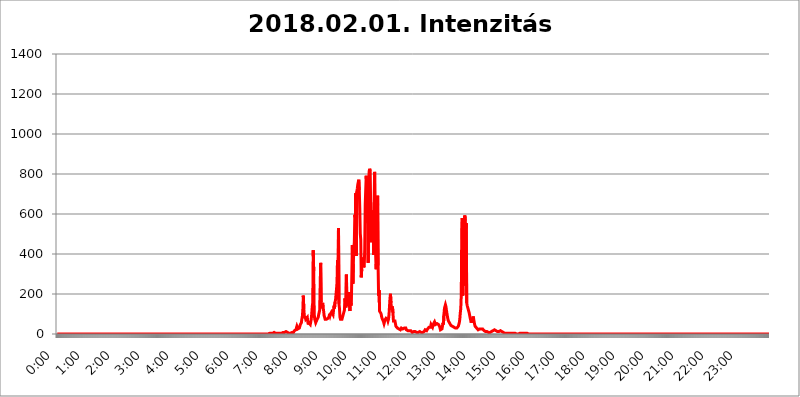
| Category | 2018.02.01. Intenzitás [W/m^2] |
|---|---|
| 0.0 | 0 |
| 0.0006944444444444445 | 0 |
| 0.001388888888888889 | 0 |
| 0.0020833333333333333 | 0 |
| 0.002777777777777778 | 0 |
| 0.003472222222222222 | 0 |
| 0.004166666666666667 | 0 |
| 0.004861111111111111 | 0 |
| 0.005555555555555556 | 0 |
| 0.0062499999999999995 | 0 |
| 0.006944444444444444 | 0 |
| 0.007638888888888889 | 0 |
| 0.008333333333333333 | 0 |
| 0.009027777777777779 | 0 |
| 0.009722222222222222 | 0 |
| 0.010416666666666666 | 0 |
| 0.011111111111111112 | 0 |
| 0.011805555555555555 | 0 |
| 0.012499999999999999 | 0 |
| 0.013194444444444444 | 0 |
| 0.013888888888888888 | 0 |
| 0.014583333333333332 | 0 |
| 0.015277777777777777 | 0 |
| 0.015972222222222224 | 0 |
| 0.016666666666666666 | 0 |
| 0.017361111111111112 | 0 |
| 0.018055555555555557 | 0 |
| 0.01875 | 0 |
| 0.019444444444444445 | 0 |
| 0.02013888888888889 | 0 |
| 0.020833333333333332 | 0 |
| 0.02152777777777778 | 0 |
| 0.022222222222222223 | 0 |
| 0.02291666666666667 | 0 |
| 0.02361111111111111 | 0 |
| 0.024305555555555556 | 0 |
| 0.024999999999999998 | 0 |
| 0.025694444444444447 | 0 |
| 0.02638888888888889 | 0 |
| 0.027083333333333334 | 0 |
| 0.027777777777777776 | 0 |
| 0.02847222222222222 | 0 |
| 0.029166666666666664 | 0 |
| 0.029861111111111113 | 0 |
| 0.030555555555555555 | 0 |
| 0.03125 | 0 |
| 0.03194444444444445 | 0 |
| 0.03263888888888889 | 0 |
| 0.03333333333333333 | 0 |
| 0.034027777777777775 | 0 |
| 0.034722222222222224 | 0 |
| 0.035416666666666666 | 0 |
| 0.036111111111111115 | 0 |
| 0.03680555555555556 | 0 |
| 0.0375 | 0 |
| 0.03819444444444444 | 0 |
| 0.03888888888888889 | 0 |
| 0.03958333333333333 | 0 |
| 0.04027777777777778 | 0 |
| 0.04097222222222222 | 0 |
| 0.041666666666666664 | 0 |
| 0.042361111111111106 | 0 |
| 0.04305555555555556 | 0 |
| 0.043750000000000004 | 0 |
| 0.044444444444444446 | 0 |
| 0.04513888888888889 | 0 |
| 0.04583333333333334 | 0 |
| 0.04652777777777778 | 0 |
| 0.04722222222222222 | 0 |
| 0.04791666666666666 | 0 |
| 0.04861111111111111 | 0 |
| 0.049305555555555554 | 0 |
| 0.049999999999999996 | 0 |
| 0.05069444444444445 | 0 |
| 0.051388888888888894 | 0 |
| 0.052083333333333336 | 0 |
| 0.05277777777777778 | 0 |
| 0.05347222222222222 | 0 |
| 0.05416666666666667 | 0 |
| 0.05486111111111111 | 0 |
| 0.05555555555555555 | 0 |
| 0.05625 | 0 |
| 0.05694444444444444 | 0 |
| 0.057638888888888885 | 0 |
| 0.05833333333333333 | 0 |
| 0.05902777777777778 | 0 |
| 0.059722222222222225 | 0 |
| 0.06041666666666667 | 0 |
| 0.061111111111111116 | 0 |
| 0.06180555555555556 | 0 |
| 0.0625 | 0 |
| 0.06319444444444444 | 0 |
| 0.06388888888888888 | 0 |
| 0.06458333333333334 | 0 |
| 0.06527777777777778 | 0 |
| 0.06597222222222222 | 0 |
| 0.06666666666666667 | 0 |
| 0.06736111111111111 | 0 |
| 0.06805555555555555 | 0 |
| 0.06874999999999999 | 0 |
| 0.06944444444444443 | 0 |
| 0.07013888888888889 | 0 |
| 0.07083333333333333 | 0 |
| 0.07152777777777779 | 0 |
| 0.07222222222222223 | 0 |
| 0.07291666666666667 | 0 |
| 0.07361111111111111 | 0 |
| 0.07430555555555556 | 0 |
| 0.075 | 0 |
| 0.07569444444444444 | 0 |
| 0.0763888888888889 | 0 |
| 0.07708333333333334 | 0 |
| 0.07777777777777778 | 0 |
| 0.07847222222222222 | 0 |
| 0.07916666666666666 | 0 |
| 0.0798611111111111 | 0 |
| 0.08055555555555556 | 0 |
| 0.08125 | 0 |
| 0.08194444444444444 | 0 |
| 0.08263888888888889 | 0 |
| 0.08333333333333333 | 0 |
| 0.08402777777777777 | 0 |
| 0.08472222222222221 | 0 |
| 0.08541666666666665 | 0 |
| 0.08611111111111112 | 0 |
| 0.08680555555555557 | 0 |
| 0.08750000000000001 | 0 |
| 0.08819444444444445 | 0 |
| 0.08888888888888889 | 0 |
| 0.08958333333333333 | 0 |
| 0.09027777777777778 | 0 |
| 0.09097222222222222 | 0 |
| 0.09166666666666667 | 0 |
| 0.09236111111111112 | 0 |
| 0.09305555555555556 | 0 |
| 0.09375 | 0 |
| 0.09444444444444444 | 0 |
| 0.09513888888888888 | 0 |
| 0.09583333333333333 | 0 |
| 0.09652777777777777 | 0 |
| 0.09722222222222222 | 0 |
| 0.09791666666666667 | 0 |
| 0.09861111111111111 | 0 |
| 0.09930555555555555 | 0 |
| 0.09999999999999999 | 0 |
| 0.10069444444444443 | 0 |
| 0.1013888888888889 | 0 |
| 0.10208333333333335 | 0 |
| 0.10277777777777779 | 0 |
| 0.10347222222222223 | 0 |
| 0.10416666666666667 | 0 |
| 0.10486111111111111 | 0 |
| 0.10555555555555556 | 0 |
| 0.10625 | 0 |
| 0.10694444444444444 | 0 |
| 0.1076388888888889 | 0 |
| 0.10833333333333334 | 0 |
| 0.10902777777777778 | 0 |
| 0.10972222222222222 | 0 |
| 0.1111111111111111 | 0 |
| 0.11180555555555556 | 0 |
| 0.11180555555555556 | 0 |
| 0.1125 | 0 |
| 0.11319444444444444 | 0 |
| 0.11388888888888889 | 0 |
| 0.11458333333333333 | 0 |
| 0.11527777777777777 | 0 |
| 0.11597222222222221 | 0 |
| 0.11666666666666665 | 0 |
| 0.1173611111111111 | 0 |
| 0.11805555555555557 | 0 |
| 0.11944444444444445 | 0 |
| 0.12013888888888889 | 0 |
| 0.12083333333333333 | 0 |
| 0.12152777777777778 | 0 |
| 0.12222222222222223 | 0 |
| 0.12291666666666667 | 0 |
| 0.12291666666666667 | 0 |
| 0.12361111111111112 | 0 |
| 0.12430555555555556 | 0 |
| 0.125 | 0 |
| 0.12569444444444444 | 0 |
| 0.12638888888888888 | 0 |
| 0.12708333333333333 | 0 |
| 0.16875 | 0 |
| 0.12847222222222224 | 0 |
| 0.12916666666666668 | 0 |
| 0.12986111111111112 | 0 |
| 0.13055555555555556 | 0 |
| 0.13125 | 0 |
| 0.13194444444444445 | 0 |
| 0.1326388888888889 | 0 |
| 0.13333333333333333 | 0 |
| 0.13402777777777777 | 0 |
| 0.13402777777777777 | 0 |
| 0.13472222222222222 | 0 |
| 0.13541666666666666 | 0 |
| 0.1361111111111111 | 0 |
| 0.13749999999999998 | 0 |
| 0.13819444444444443 | 0 |
| 0.1388888888888889 | 0 |
| 0.13958333333333334 | 0 |
| 0.14027777777777778 | 0 |
| 0.14097222222222222 | 0 |
| 0.14166666666666666 | 0 |
| 0.1423611111111111 | 0 |
| 0.14305555555555557 | 0 |
| 0.14375000000000002 | 0 |
| 0.14444444444444446 | 0 |
| 0.1451388888888889 | 0 |
| 0.1451388888888889 | 0 |
| 0.14652777777777778 | 0 |
| 0.14722222222222223 | 0 |
| 0.14791666666666667 | 0 |
| 0.1486111111111111 | 0 |
| 0.14930555555555555 | 0 |
| 0.15 | 0 |
| 0.15069444444444444 | 0 |
| 0.15138888888888888 | 0 |
| 0.15208333333333332 | 0 |
| 0.15277777777777776 | 0 |
| 0.15347222222222223 | 0 |
| 0.15416666666666667 | 0 |
| 0.15486111111111112 | 0 |
| 0.15555555555555556 | 0 |
| 0.15625 | 0 |
| 0.15694444444444444 | 0 |
| 0.15763888888888888 | 0 |
| 0.15833333333333333 | 0 |
| 0.15902777777777777 | 0 |
| 0.15972222222222224 | 0 |
| 0.16041666666666668 | 0 |
| 0.16111111111111112 | 0 |
| 0.16180555555555556 | 0 |
| 0.1625 | 0 |
| 0.16319444444444445 | 0 |
| 0.1638888888888889 | 0 |
| 0.16458333333333333 | 0 |
| 0.16527777777777777 | 0 |
| 0.16597222222222222 | 0 |
| 0.16666666666666666 | 0 |
| 0.1673611111111111 | 0 |
| 0.16805555555555554 | 0 |
| 0.16874999999999998 | 0 |
| 0.16944444444444443 | 0 |
| 0.17013888888888887 | 0 |
| 0.1708333333333333 | 0 |
| 0.17152777777777775 | 0 |
| 0.17222222222222225 | 0 |
| 0.1729166666666667 | 0 |
| 0.17361111111111113 | 0 |
| 0.17430555555555557 | 0 |
| 0.17500000000000002 | 0 |
| 0.17569444444444446 | 0 |
| 0.1763888888888889 | 0 |
| 0.17708333333333334 | 0 |
| 0.17777777777777778 | 0 |
| 0.17847222222222223 | 0 |
| 0.17916666666666667 | 0 |
| 0.1798611111111111 | 0 |
| 0.18055555555555555 | 0 |
| 0.18125 | 0 |
| 0.18194444444444444 | 0 |
| 0.1826388888888889 | 0 |
| 0.18333333333333335 | 0 |
| 0.1840277777777778 | 0 |
| 0.18472222222222223 | 0 |
| 0.18541666666666667 | 0 |
| 0.18611111111111112 | 0 |
| 0.18680555555555556 | 0 |
| 0.1875 | 0 |
| 0.18819444444444444 | 0 |
| 0.18888888888888888 | 0 |
| 0.18958333333333333 | 0 |
| 0.19027777777777777 | 0 |
| 0.1909722222222222 | 0 |
| 0.19166666666666665 | 0 |
| 0.19236111111111112 | 0 |
| 0.19305555555555554 | 0 |
| 0.19375 | 0 |
| 0.19444444444444445 | 0 |
| 0.1951388888888889 | 0 |
| 0.19583333333333333 | 0 |
| 0.19652777777777777 | 0 |
| 0.19722222222222222 | 0 |
| 0.19791666666666666 | 0 |
| 0.1986111111111111 | 0 |
| 0.19930555555555554 | 0 |
| 0.19999999999999998 | 0 |
| 0.20069444444444443 | 0 |
| 0.20138888888888887 | 0 |
| 0.2020833333333333 | 0 |
| 0.2027777777777778 | 0 |
| 0.2034722222222222 | 0 |
| 0.2041666666666667 | 0 |
| 0.20486111111111113 | 0 |
| 0.20555555555555557 | 0 |
| 0.20625000000000002 | 0 |
| 0.20694444444444446 | 0 |
| 0.2076388888888889 | 0 |
| 0.20833333333333334 | 0 |
| 0.20902777777777778 | 0 |
| 0.20972222222222223 | 0 |
| 0.21041666666666667 | 0 |
| 0.2111111111111111 | 0 |
| 0.21180555555555555 | 0 |
| 0.2125 | 0 |
| 0.21319444444444444 | 0 |
| 0.2138888888888889 | 0 |
| 0.21458333333333335 | 0 |
| 0.2152777777777778 | 0 |
| 0.21597222222222223 | 0 |
| 0.21666666666666667 | 0 |
| 0.21736111111111112 | 0 |
| 0.21805555555555556 | 0 |
| 0.21875 | 0 |
| 0.21944444444444444 | 0 |
| 0.22013888888888888 | 0 |
| 0.22083333333333333 | 0 |
| 0.22152777777777777 | 0 |
| 0.2222222222222222 | 0 |
| 0.22291666666666665 | 0 |
| 0.2236111111111111 | 0 |
| 0.22430555555555556 | 0 |
| 0.225 | 0 |
| 0.22569444444444445 | 0 |
| 0.2263888888888889 | 0 |
| 0.22708333333333333 | 0 |
| 0.22777777777777777 | 0 |
| 0.22847222222222222 | 0 |
| 0.22916666666666666 | 0 |
| 0.2298611111111111 | 0 |
| 0.23055555555555554 | 0 |
| 0.23124999999999998 | 0 |
| 0.23194444444444443 | 0 |
| 0.23263888888888887 | 0 |
| 0.2333333333333333 | 0 |
| 0.2340277777777778 | 0 |
| 0.2347222222222222 | 0 |
| 0.2354166666666667 | 0 |
| 0.23611111111111113 | 0 |
| 0.23680555555555557 | 0 |
| 0.23750000000000002 | 0 |
| 0.23819444444444446 | 0 |
| 0.2388888888888889 | 0 |
| 0.23958333333333334 | 0 |
| 0.24027777777777778 | 0 |
| 0.24097222222222223 | 0 |
| 0.24166666666666667 | 0 |
| 0.2423611111111111 | 0 |
| 0.24305555555555555 | 0 |
| 0.24375 | 0 |
| 0.24444444444444446 | 0 |
| 0.24513888888888888 | 0 |
| 0.24583333333333335 | 0 |
| 0.2465277777777778 | 0 |
| 0.24722222222222223 | 0 |
| 0.24791666666666667 | 0 |
| 0.24861111111111112 | 0 |
| 0.24930555555555556 | 0 |
| 0.25 | 0 |
| 0.25069444444444444 | 0 |
| 0.2513888888888889 | 0 |
| 0.2520833333333333 | 0 |
| 0.25277777777777777 | 0 |
| 0.2534722222222222 | 0 |
| 0.25416666666666665 | 0 |
| 0.2548611111111111 | 0 |
| 0.2555555555555556 | 0 |
| 0.25625000000000003 | 0 |
| 0.2569444444444445 | 0 |
| 0.2576388888888889 | 0 |
| 0.25833333333333336 | 0 |
| 0.2590277777777778 | 0 |
| 0.25972222222222224 | 0 |
| 0.2604166666666667 | 0 |
| 0.2611111111111111 | 0 |
| 0.26180555555555557 | 0 |
| 0.2625 | 0 |
| 0.26319444444444445 | 0 |
| 0.2638888888888889 | 0 |
| 0.26458333333333334 | 0 |
| 0.2652777777777778 | 0 |
| 0.2659722222222222 | 0 |
| 0.26666666666666666 | 0 |
| 0.2673611111111111 | 0 |
| 0.26805555555555555 | 0 |
| 0.26875 | 0 |
| 0.26944444444444443 | 0 |
| 0.2701388888888889 | 0 |
| 0.2708333333333333 | 0 |
| 0.27152777777777776 | 0 |
| 0.2722222222222222 | 0 |
| 0.27291666666666664 | 0 |
| 0.2736111111111111 | 0 |
| 0.2743055555555555 | 0 |
| 0.27499999999999997 | 0 |
| 0.27569444444444446 | 0 |
| 0.27638888888888885 | 0 |
| 0.27708333333333335 | 0 |
| 0.2777777777777778 | 0 |
| 0.27847222222222223 | 0 |
| 0.2791666666666667 | 0 |
| 0.2798611111111111 | 0 |
| 0.28055555555555556 | 0 |
| 0.28125 | 0 |
| 0.28194444444444444 | 0 |
| 0.2826388888888889 | 0 |
| 0.2833333333333333 | 0 |
| 0.28402777777777777 | 0 |
| 0.2847222222222222 | 0 |
| 0.28541666666666665 | 0 |
| 0.28611111111111115 | 0 |
| 0.28680555555555554 | 0 |
| 0.28750000000000003 | 0 |
| 0.2881944444444445 | 0 |
| 0.2888888888888889 | 0 |
| 0.28958333333333336 | 0 |
| 0.2902777777777778 | 0 |
| 0.29097222222222224 | 0 |
| 0.2916666666666667 | 0 |
| 0.2923611111111111 | 0 |
| 0.29305555555555557 | 0 |
| 0.29375 | 0 |
| 0.29444444444444445 | 0 |
| 0.2951388888888889 | 0 |
| 0.29583333333333334 | 0 |
| 0.2965277777777778 | 3.525 |
| 0.2972222222222222 | 3.525 |
| 0.29791666666666666 | 3.525 |
| 0.2986111111111111 | 3.525 |
| 0.29930555555555555 | 3.525 |
| 0.3 | 3.525 |
| 0.30069444444444443 | 3.525 |
| 0.3013888888888889 | 3.525 |
| 0.3020833333333333 | 3.525 |
| 0.30277777777777776 | 3.525 |
| 0.3034722222222222 | 3.525 |
| 0.30416666666666664 | 7.887 |
| 0.3048611111111111 | 7.887 |
| 0.3055555555555555 | 7.887 |
| 0.30624999999999997 | 3.525 |
| 0.3069444444444444 | 3.525 |
| 0.3076388888888889 | 3.525 |
| 0.30833333333333335 | 3.525 |
| 0.3090277777777778 | 3.525 |
| 0.30972222222222223 | 3.525 |
| 0.3104166666666667 | 3.525 |
| 0.3111111111111111 | 3.525 |
| 0.31180555555555556 | 3.525 |
| 0.3125 | 3.525 |
| 0.31319444444444444 | 3.525 |
| 0.3138888888888889 | 7.887 |
| 0.3145833333333333 | 3.525 |
| 0.31527777777777777 | 3.525 |
| 0.3159722222222222 | 7.887 |
| 0.31666666666666665 | 7.887 |
| 0.31736111111111115 | 7.887 |
| 0.31805555555555554 | 7.887 |
| 0.31875000000000003 | 7.887 |
| 0.3194444444444445 | 7.887 |
| 0.3201388888888889 | 7.887 |
| 0.32083333333333336 | 12.257 |
| 0.3215277777777778 | 7.887 |
| 0.32222222222222224 | 7.887 |
| 0.3229166666666667 | 7.887 |
| 0.3236111111111111 | 7.887 |
| 0.32430555555555557 | 3.525 |
| 0.325 | 3.525 |
| 0.32569444444444445 | 3.525 |
| 0.3263888888888889 | 3.525 |
| 0.32708333333333334 | 3.525 |
| 0.3277777777777778 | 3.525 |
| 0.3284722222222222 | 7.887 |
| 0.32916666666666666 | 7.887 |
| 0.3298611111111111 | 3.525 |
| 0.33055555555555555 | 7.887 |
| 0.33125 | 7.887 |
| 0.33194444444444443 | 7.887 |
| 0.3326388888888889 | 16.636 |
| 0.3333333333333333 | 16.636 |
| 0.3340277777777778 | 16.636 |
| 0.3347222222222222 | 21.024 |
| 0.3354166666666667 | 29.823 |
| 0.3361111111111111 | 38.653 |
| 0.3368055555555556 | 38.653 |
| 0.33749999999999997 | 25.419 |
| 0.33819444444444446 | 25.419 |
| 0.33888888888888885 | 29.823 |
| 0.33958333333333335 | 29.823 |
| 0.34027777777777773 | 34.234 |
| 0.34097222222222223 | 47.511 |
| 0.3416666666666666 | 47.511 |
| 0.3423611111111111 | 56.398 |
| 0.3430555555555555 | 74.246 |
| 0.34375 | 87.692 |
| 0.3444444444444445 | 119.235 |
| 0.3451388888888889 | 191.937 |
| 0.3458333333333334 | 123.758 |
| 0.34652777777777777 | 92.184 |
| 0.34722222222222227 | 78.722 |
| 0.34791666666666665 | 87.692 |
| 0.34861111111111115 | 74.246 |
| 0.34930555555555554 | 69.775 |
| 0.35000000000000003 | 74.246 |
| 0.3506944444444444 | 83.205 |
| 0.3513888888888889 | 60.85 |
| 0.3520833333333333 | 47.511 |
| 0.3527777777777778 | 56.398 |
| 0.3534722222222222 | 56.398 |
| 0.3541666666666667 | 51.951 |
| 0.3548611111111111 | 47.511 |
| 0.35555555555555557 | 47.511 |
| 0.35625 | 74.246 |
| 0.35694444444444445 | 101.184 |
| 0.3576388888888889 | 137.347 |
| 0.35833333333333334 | 155.509 |
| 0.3590277777777778 | 418.492 |
| 0.3597222222222222 | 314.98 |
| 0.36041666666666666 | 101.184 |
| 0.3611111111111111 | 74.246 |
| 0.36180555555555555 | 74.246 |
| 0.3625 | 56.398 |
| 0.36319444444444443 | 51.951 |
| 0.3638888888888889 | 60.85 |
| 0.3645833333333333 | 74.246 |
| 0.3652777777777778 | 78.722 |
| 0.3659722222222222 | 83.205 |
| 0.3666666666666667 | 96.682 |
| 0.3673611111111111 | 96.682 |
| 0.3680555555555556 | 119.235 |
| 0.36874999999999997 | 119.235 |
| 0.36944444444444446 | 355.712 |
| 0.37013888888888885 | 160.056 |
| 0.37083333333333335 | 128.284 |
| 0.37152777777777773 | 123.758 |
| 0.37222222222222223 | 155.509 |
| 0.3729166666666666 | 132.814 |
| 0.3736111111111111 | 114.716 |
| 0.3743055555555555 | 92.184 |
| 0.375 | 92.184 |
| 0.3756944444444445 | 74.246 |
| 0.3763888888888889 | 69.775 |
| 0.3770833333333334 | 78.722 |
| 0.37777777777777777 | 74.246 |
| 0.37847222222222227 | 74.246 |
| 0.37916666666666665 | 69.775 |
| 0.37986111111111115 | 78.722 |
| 0.38055555555555554 | 78.722 |
| 0.38125000000000003 | 87.692 |
| 0.3819444444444444 | 101.184 |
| 0.3826388888888889 | 92.184 |
| 0.3833333333333333 | 101.184 |
| 0.3840277777777778 | 105.69 |
| 0.3847222222222222 | 110.201 |
| 0.3854166666666667 | 105.69 |
| 0.3861111111111111 | 110.201 |
| 0.38680555555555557 | 96.682 |
| 0.3875 | 119.235 |
| 0.38819444444444445 | 141.884 |
| 0.3888888888888889 | 128.284 |
| 0.38958333333333334 | 160.056 |
| 0.3902777777777778 | 169.156 |
| 0.3909722222222222 | 196.497 |
| 0.39166666666666666 | 223.873 |
| 0.3923611111111111 | 255.813 |
| 0.39305555555555555 | 369.23 |
| 0.39375 | 173.709 |
| 0.39444444444444443 | 528.2 |
| 0.3951388888888889 | 150.964 |
| 0.3958333333333333 | 128.284 |
| 0.3965277777777778 | 83.205 |
| 0.3972222222222222 | 74.246 |
| 0.3979166666666667 | 69.775 |
| 0.3986111111111111 | 69.775 |
| 0.3993055555555556 | 74.246 |
| 0.39999999999999997 | 74.246 |
| 0.40069444444444446 | 92.184 |
| 0.40138888888888885 | 92.184 |
| 0.40208333333333335 | 110.201 |
| 0.40277777777777773 | 119.235 |
| 0.40347222222222223 | 178.264 |
| 0.4041666666666666 | 160.056 |
| 0.4048611111111111 | 132.814 |
| 0.4055555555555555 | 296.808 |
| 0.40625 | 141.884 |
| 0.4069444444444445 | 164.605 |
| 0.4076388888888889 | 187.378 |
| 0.4083333333333334 | 155.509 |
| 0.40902777777777777 | 210.182 |
| 0.40972222222222227 | 155.509 |
| 0.41041666666666665 | 114.716 |
| 0.41111111111111115 | 164.605 |
| 0.41180555555555554 | 141.884 |
| 0.41250000000000003 | 155.509 |
| 0.4131944444444444 | 160.056 |
| 0.4138888888888889 | 445.129 |
| 0.4145833333333333 | 251.251 |
| 0.4152777777777778 | 351.198 |
| 0.4159722222222222 | 431.833 |
| 0.4166666666666667 | 458.38 |
| 0.4173611111111111 | 596.45 |
| 0.41805555555555557 | 583.779 |
| 0.41875 | 703.762 |
| 0.41944444444444445 | 391.685 |
| 0.4201388888888889 | 711.832 |
| 0.42083333333333334 | 727.896 |
| 0.4215277777777778 | 747.834 |
| 0.4222222222222222 | 759.723 |
| 0.42291666666666666 | 771.559 |
| 0.4236111111111111 | 719.877 |
| 0.42430555555555555 | 629.948 |
| 0.425 | 502.192 |
| 0.42569444444444443 | 471.582 |
| 0.4263888888888889 | 283.156 |
| 0.4270833333333333 | 324.052 |
| 0.4277777777777778 | 382.715 |
| 0.4284722222222222 | 360.221 |
| 0.4291666666666667 | 364.728 |
| 0.4298611111111111 | 333.113 |
| 0.4305555555555556 | 342.162 |
| 0.43124999999999997 | 422.943 |
| 0.43194444444444446 | 646.537 |
| 0.43263888888888885 | 719.877 |
| 0.43333333333333335 | 791.169 |
| 0.43402777777777773 | 747.834 |
| 0.43472222222222223 | 767.62 |
| 0.4354166666666666 | 553.986 |
| 0.4361111111111111 | 355.712 |
| 0.4368055555555555 | 767.62 |
| 0.4375 | 814.519 |
| 0.4381944444444445 | 826.123 |
| 0.4388888888888889 | 814.519 |
| 0.4395833333333334 | 650.667 |
| 0.44027777777777777 | 458.38 |
| 0.44097222222222227 | 541.121 |
| 0.44166666666666665 | 536.82 |
| 0.44236111111111115 | 515.223 |
| 0.44305555555555554 | 617.436 |
| 0.44375000000000003 | 396.164 |
| 0.4444444444444444 | 658.909 |
| 0.4451388888888889 | 810.641 |
| 0.4458333333333333 | 502.192 |
| 0.4465277777777778 | 400.638 |
| 0.4472222222222222 | 324.052 |
| 0.4479166666666667 | 373.729 |
| 0.4486111111111111 | 333.113 |
| 0.44930555555555557 | 691.608 |
| 0.45 | 342.162 |
| 0.45069444444444445 | 191.937 |
| 0.4513888888888889 | 219.309 |
| 0.45208333333333334 | 114.716 |
| 0.4527777777777778 | 110.201 |
| 0.4534722222222222 | 110.201 |
| 0.45416666666666666 | 101.184 |
| 0.4548611111111111 | 87.692 |
| 0.45555555555555555 | 78.722 |
| 0.45625 | 74.246 |
| 0.45694444444444443 | 74.246 |
| 0.4576388888888889 | 60.85 |
| 0.4583333333333333 | 51.951 |
| 0.4590277777777778 | 60.85 |
| 0.4597222222222222 | 69.775 |
| 0.4604166666666667 | 74.246 |
| 0.4611111111111111 | 78.722 |
| 0.4618055555555556 | 78.722 |
| 0.46249999999999997 | 78.722 |
| 0.46319444444444446 | 74.246 |
| 0.46388888888888885 | 65.31 |
| 0.46458333333333335 | 74.246 |
| 0.46527777777777773 | 96.682 |
| 0.46597222222222223 | 137.347 |
| 0.4666666666666666 | 178.264 |
| 0.4673611111111111 | 201.058 |
| 0.4680555555555555 | 155.509 |
| 0.46875 | 128.284 |
| 0.4694444444444445 | 119.235 |
| 0.4701388888888889 | 137.347 |
| 0.4708333333333334 | 105.69 |
| 0.47152777777777777 | 65.31 |
| 0.47222222222222227 | 65.31 |
| 0.47291666666666665 | 65.31 |
| 0.47361111111111115 | 65.31 |
| 0.47430555555555554 | 60.85 |
| 0.47500000000000003 | 38.653 |
| 0.4756944444444444 | 34.234 |
| 0.4763888888888889 | 38.653 |
| 0.4770833333333333 | 29.823 |
| 0.4777777777777778 | 29.823 |
| 0.4784722222222222 | 29.823 |
| 0.4791666666666667 | 25.419 |
| 0.4798611111111111 | 21.024 |
| 0.48055555555555557 | 21.024 |
| 0.48125 | 21.024 |
| 0.48194444444444445 | 25.419 |
| 0.4826388888888889 | 29.823 |
| 0.48333333333333334 | 29.823 |
| 0.4840277777777778 | 29.823 |
| 0.4847222222222222 | 25.419 |
| 0.48541666666666666 | 25.419 |
| 0.4861111111111111 | 25.419 |
| 0.48680555555555555 | 29.823 |
| 0.4875 | 25.419 |
| 0.48819444444444443 | 29.823 |
| 0.4888888888888889 | 29.823 |
| 0.4895833333333333 | 21.024 |
| 0.4902777777777778 | 16.636 |
| 0.4909722222222222 | 16.636 |
| 0.4916666666666667 | 16.636 |
| 0.4923611111111111 | 12.257 |
| 0.4930555555555556 | 12.257 |
| 0.49374999999999997 | 16.636 |
| 0.49444444444444446 | 16.636 |
| 0.49513888888888885 | 21.024 |
| 0.49583333333333335 | 16.636 |
| 0.49652777777777773 | 12.257 |
| 0.49722222222222223 | 12.257 |
| 0.4979166666666666 | 7.887 |
| 0.4986111111111111 | 12.257 |
| 0.4993055555555555 | 12.257 |
| 0.5 | 12.257 |
| 0.5006944444444444 | 12.257 |
| 0.5013888888888889 | 12.257 |
| 0.5020833333333333 | 12.257 |
| 0.5027777777777778 | 7.887 |
| 0.5034722222222222 | 7.887 |
| 0.5041666666666667 | 7.887 |
| 0.5048611111111111 | 12.257 |
| 0.5055555555555555 | 7.887 |
| 0.50625 | 7.887 |
| 0.5069444444444444 | 7.887 |
| 0.5076388888888889 | 7.887 |
| 0.5083333333333333 | 12.257 |
| 0.5090277777777777 | 12.257 |
| 0.5097222222222222 | 12.257 |
| 0.5104166666666666 | 7.887 |
| 0.5111111111111112 | 7.887 |
| 0.5118055555555555 | 7.887 |
| 0.5125000000000001 | 7.887 |
| 0.5131944444444444 | 12.257 |
| 0.513888888888889 | 12.257 |
| 0.5145833333333333 | 12.257 |
| 0.5152777777777778 | 16.636 |
| 0.5159722222222222 | 21.024 |
| 0.5166666666666667 | 21.024 |
| 0.517361111111111 | 16.636 |
| 0.5180555555555556 | 16.636 |
| 0.5187499999999999 | 21.024 |
| 0.5194444444444445 | 25.419 |
| 0.5201388888888888 | 29.823 |
| 0.5208333333333334 | 29.823 |
| 0.5215277777777778 | 34.234 |
| 0.5222222222222223 | 38.653 |
| 0.5229166666666667 | 34.234 |
| 0.5236111111111111 | 34.234 |
| 0.5243055555555556 | 47.511 |
| 0.525 | 51.951 |
| 0.5256944444444445 | 43.079 |
| 0.5263888888888889 | 34.234 |
| 0.5270833333333333 | 38.653 |
| 0.5277777777777778 | 51.951 |
| 0.5284722222222222 | 51.951 |
| 0.5291666666666667 | 60.85 |
| 0.5298611111111111 | 56.398 |
| 0.5305555555555556 | 47.511 |
| 0.53125 | 47.511 |
| 0.5319444444444444 | 47.511 |
| 0.5326388888888889 | 51.951 |
| 0.5333333333333333 | 47.511 |
| 0.5340277777777778 | 47.511 |
| 0.5347222222222222 | 47.511 |
| 0.5354166666666667 | 43.079 |
| 0.5361111111111111 | 38.653 |
| 0.5368055555555555 | 29.823 |
| 0.5375 | 21.024 |
| 0.5381944444444444 | 21.024 |
| 0.5388888888888889 | 21.024 |
| 0.5395833333333333 | 25.419 |
| 0.5402777777777777 | 38.653 |
| 0.5409722222222222 | 56.398 |
| 0.5416666666666666 | 47.511 |
| 0.5423611111111112 | 96.682 |
| 0.5430555555555555 | 128.284 |
| 0.5437500000000001 | 137.347 |
| 0.5444444444444444 | 146.423 |
| 0.545138888888889 | 137.347 |
| 0.5458333333333333 | 119.235 |
| 0.5465277777777778 | 114.716 |
| 0.5472222222222222 | 87.692 |
| 0.5479166666666667 | 74.246 |
| 0.548611111111111 | 65.31 |
| 0.5493055555555556 | 65.31 |
| 0.5499999999999999 | 65.31 |
| 0.5506944444444445 | 51.951 |
| 0.5513888888888888 | 47.511 |
| 0.5520833333333334 | 43.079 |
| 0.5527777777777778 | 43.079 |
| 0.5534722222222223 | 38.653 |
| 0.5541666666666667 | 38.653 |
| 0.5548611111111111 | 34.234 |
| 0.5555555555555556 | 34.234 |
| 0.55625 | 34.234 |
| 0.5569444444444445 | 29.823 |
| 0.5576388888888889 | 29.823 |
| 0.5583333333333333 | 29.823 |
| 0.5590277777777778 | 29.823 |
| 0.5597222222222222 | 29.823 |
| 0.5604166666666667 | 29.823 |
| 0.5611111111111111 | 29.823 |
| 0.5618055555555556 | 34.234 |
| 0.5625 | 38.653 |
| 0.5631944444444444 | 47.511 |
| 0.5638888888888889 | 56.398 |
| 0.5645833333333333 | 74.246 |
| 0.5652777777777778 | 105.69 |
| 0.5659722222222222 | 128.284 |
| 0.5666666666666667 | 196.497 |
| 0.5673611111111111 | 515.223 |
| 0.5680555555555555 | 579.542 |
| 0.56875 | 191.937 |
| 0.5694444444444444 | 523.88 |
| 0.5701388888888889 | 575.299 |
| 0.5708333333333333 | 242.127 |
| 0.5715277777777777 | 592.233 |
| 0.5722222222222222 | 566.793 |
| 0.5729166666666666 | 528.2 |
| 0.5736111111111112 | 553.986 |
| 0.5743055555555555 | 155.509 |
| 0.5750000000000001 | 141.884 |
| 0.5756944444444444 | 141.884 |
| 0.576388888888889 | 141.884 |
| 0.5770833333333333 | 114.716 |
| 0.5777777777777778 | 105.69 |
| 0.5784722222222222 | 92.184 |
| 0.5791666666666667 | 78.722 |
| 0.579861111111111 | 69.775 |
| 0.5805555555555556 | 56.398 |
| 0.5812499999999999 | 65.31 |
| 0.5819444444444445 | 69.775 |
| 0.5826388888888888 | 78.722 |
| 0.5833333333333334 | 87.692 |
| 0.5840277777777778 | 74.246 |
| 0.5847222222222223 | 60.85 |
| 0.5854166666666667 | 47.511 |
| 0.5861111111111111 | 38.653 |
| 0.5868055555555556 | 38.653 |
| 0.5875 | 34.234 |
| 0.5881944444444445 | 29.823 |
| 0.5888888888888889 | 25.419 |
| 0.5895833333333333 | 25.419 |
| 0.5902777777777778 | 21.024 |
| 0.5909722222222222 | 21.024 |
| 0.5916666666666667 | 25.419 |
| 0.5923611111111111 | 25.419 |
| 0.5930555555555556 | 25.419 |
| 0.59375 | 25.419 |
| 0.5944444444444444 | 25.419 |
| 0.5951388888888889 | 25.419 |
| 0.5958333333333333 | 25.419 |
| 0.5965277777777778 | 25.419 |
| 0.5972222222222222 | 21.024 |
| 0.5979166666666667 | 21.024 |
| 0.5986111111111111 | 16.636 |
| 0.5993055555555555 | 16.636 |
| 0.6 | 16.636 |
| 0.6006944444444444 | 12.257 |
| 0.6013888888888889 | 12.257 |
| 0.6020833333333333 | 12.257 |
| 0.6027777777777777 | 12.257 |
| 0.6034722222222222 | 12.257 |
| 0.6041666666666666 | 12.257 |
| 0.6048611111111112 | 7.887 |
| 0.6055555555555555 | 7.887 |
| 0.6062500000000001 | 7.887 |
| 0.6069444444444444 | 7.887 |
| 0.607638888888889 | 12.257 |
| 0.6083333333333333 | 12.257 |
| 0.6090277777777778 | 12.257 |
| 0.6097222222222222 | 12.257 |
| 0.6104166666666667 | 12.257 |
| 0.611111111111111 | 16.636 |
| 0.6118055555555556 | 16.636 |
| 0.6124999999999999 | 16.636 |
| 0.6131944444444445 | 21.024 |
| 0.6138888888888888 | 21.024 |
| 0.6145833333333334 | 16.636 |
| 0.6152777777777778 | 16.636 |
| 0.6159722222222223 | 16.636 |
| 0.6166666666666667 | 16.636 |
| 0.6173611111111111 | 12.257 |
| 0.6180555555555556 | 12.257 |
| 0.61875 | 12.257 |
| 0.6194444444444445 | 12.257 |
| 0.6201388888888889 | 12.257 |
| 0.6208333333333333 | 12.257 |
| 0.6215277777777778 | 16.636 |
| 0.6222222222222222 | 16.636 |
| 0.6229166666666667 | 16.636 |
| 0.6236111111111111 | 12.257 |
| 0.6243055555555556 | 12.257 |
| 0.625 | 7.887 |
| 0.6256944444444444 | 7.887 |
| 0.6263888888888889 | 3.525 |
| 0.6270833333333333 | 3.525 |
| 0.6277777777777778 | 3.525 |
| 0.6284722222222222 | 3.525 |
| 0.6291666666666667 | 3.525 |
| 0.6298611111111111 | 3.525 |
| 0.6305555555555555 | 3.525 |
| 0.63125 | 3.525 |
| 0.6319444444444444 | 3.525 |
| 0.6326388888888889 | 3.525 |
| 0.6333333333333333 | 3.525 |
| 0.6340277777777777 | 3.525 |
| 0.6347222222222222 | 3.525 |
| 0.6354166666666666 | 3.525 |
| 0.6361111111111112 | 3.525 |
| 0.6368055555555555 | 3.525 |
| 0.6375000000000001 | 3.525 |
| 0.6381944444444444 | 3.525 |
| 0.638888888888889 | 3.525 |
| 0.6395833333333333 | 3.525 |
| 0.6402777777777778 | 3.525 |
| 0.6409722222222222 | 3.525 |
| 0.6416666666666667 | 3.525 |
| 0.642361111111111 | 3.525 |
| 0.6430555555555556 | 3.525 |
| 0.6437499999999999 | 0 |
| 0.6444444444444445 | 0 |
| 0.6451388888888888 | 0 |
| 0.6458333333333334 | 0 |
| 0.6465277777777778 | 0 |
| 0.6472222222222223 | 3.525 |
| 0.6479166666666667 | 3.525 |
| 0.6486111111111111 | 3.525 |
| 0.6493055555555556 | 3.525 |
| 0.65 | 3.525 |
| 0.6506944444444445 | 3.525 |
| 0.6513888888888889 | 3.525 |
| 0.6520833333333333 | 3.525 |
| 0.6527777777777778 | 3.525 |
| 0.6534722222222222 | 3.525 |
| 0.6541666666666667 | 3.525 |
| 0.6548611111111111 | 3.525 |
| 0.6555555555555556 | 3.525 |
| 0.65625 | 3.525 |
| 0.6569444444444444 | 3.525 |
| 0.6576388888888889 | 3.525 |
| 0.6583333333333333 | 3.525 |
| 0.6590277777777778 | 3.525 |
| 0.6597222222222222 | 3.525 |
| 0.6604166666666667 | 0 |
| 0.6611111111111111 | 0 |
| 0.6618055555555555 | 0 |
| 0.6625 | 0 |
| 0.6631944444444444 | 0 |
| 0.6638888888888889 | 0 |
| 0.6645833333333333 | 0 |
| 0.6652777777777777 | 0 |
| 0.6659722222222222 | 0 |
| 0.6666666666666666 | 0 |
| 0.6673611111111111 | 0 |
| 0.6680555555555556 | 0 |
| 0.6687500000000001 | 0 |
| 0.6694444444444444 | 0 |
| 0.6701388888888888 | 0 |
| 0.6708333333333334 | 0 |
| 0.6715277777777778 | 0 |
| 0.6722222222222222 | 0 |
| 0.6729166666666666 | 0 |
| 0.6736111111111112 | 0 |
| 0.6743055555555556 | 0 |
| 0.6749999999999999 | 0 |
| 0.6756944444444444 | 0 |
| 0.6763888888888889 | 0 |
| 0.6770833333333334 | 0 |
| 0.6777777777777777 | 0 |
| 0.6784722222222223 | 0 |
| 0.6791666666666667 | 0 |
| 0.6798611111111111 | 0 |
| 0.6805555555555555 | 0 |
| 0.68125 | 0 |
| 0.6819444444444445 | 0 |
| 0.6826388888888889 | 0 |
| 0.6833333333333332 | 0 |
| 0.6840277777777778 | 0 |
| 0.6847222222222222 | 0 |
| 0.6854166666666667 | 0 |
| 0.686111111111111 | 0 |
| 0.6868055555555556 | 0 |
| 0.6875 | 0 |
| 0.6881944444444444 | 0 |
| 0.688888888888889 | 0 |
| 0.6895833333333333 | 0 |
| 0.6902777777777778 | 0 |
| 0.6909722222222222 | 0 |
| 0.6916666666666668 | 0 |
| 0.6923611111111111 | 0 |
| 0.6930555555555555 | 0 |
| 0.69375 | 0 |
| 0.6944444444444445 | 0 |
| 0.6951388888888889 | 0 |
| 0.6958333333333333 | 0 |
| 0.6965277777777777 | 0 |
| 0.6972222222222223 | 0 |
| 0.6979166666666666 | 0 |
| 0.6986111111111111 | 0 |
| 0.6993055555555556 | 0 |
| 0.7000000000000001 | 0 |
| 0.7006944444444444 | 0 |
| 0.7013888888888888 | 0 |
| 0.7020833333333334 | 0 |
| 0.7027777777777778 | 0 |
| 0.7034722222222222 | 0 |
| 0.7041666666666666 | 0 |
| 0.7048611111111112 | 0 |
| 0.7055555555555556 | 0 |
| 0.7062499999999999 | 0 |
| 0.7069444444444444 | 0 |
| 0.7076388888888889 | 0 |
| 0.7083333333333334 | 0 |
| 0.7090277777777777 | 0 |
| 0.7097222222222223 | 0 |
| 0.7104166666666667 | 0 |
| 0.7111111111111111 | 0 |
| 0.7118055555555555 | 0 |
| 0.7125 | 0 |
| 0.7131944444444445 | 0 |
| 0.7138888888888889 | 0 |
| 0.7145833333333332 | 0 |
| 0.7152777777777778 | 0 |
| 0.7159722222222222 | 0 |
| 0.7166666666666667 | 0 |
| 0.717361111111111 | 0 |
| 0.7180555555555556 | 0 |
| 0.71875 | 0 |
| 0.7194444444444444 | 0 |
| 0.720138888888889 | 0 |
| 0.7208333333333333 | 0 |
| 0.7215277777777778 | 0 |
| 0.7222222222222222 | 0 |
| 0.7229166666666668 | 0 |
| 0.7236111111111111 | 0 |
| 0.7243055555555555 | 0 |
| 0.725 | 0 |
| 0.7256944444444445 | 0 |
| 0.7263888888888889 | 0 |
| 0.7270833333333333 | 0 |
| 0.7277777777777777 | 0 |
| 0.7284722222222223 | 0 |
| 0.7291666666666666 | 0 |
| 0.7298611111111111 | 0 |
| 0.7305555555555556 | 0 |
| 0.7312500000000001 | 0 |
| 0.7319444444444444 | 0 |
| 0.7326388888888888 | 0 |
| 0.7333333333333334 | 0 |
| 0.7340277777777778 | 0 |
| 0.7347222222222222 | 0 |
| 0.7354166666666666 | 0 |
| 0.7361111111111112 | 0 |
| 0.7368055555555556 | 0 |
| 0.7374999999999999 | 0 |
| 0.7381944444444444 | 0 |
| 0.7388888888888889 | 0 |
| 0.7395833333333334 | 0 |
| 0.7402777777777777 | 0 |
| 0.7409722222222223 | 0 |
| 0.7416666666666667 | 0 |
| 0.7423611111111111 | 0 |
| 0.7430555555555555 | 0 |
| 0.74375 | 0 |
| 0.7444444444444445 | 0 |
| 0.7451388888888889 | 0 |
| 0.7458333333333332 | 0 |
| 0.7465277777777778 | 0 |
| 0.7472222222222222 | 0 |
| 0.7479166666666667 | 0 |
| 0.748611111111111 | 0 |
| 0.7493055555555556 | 0 |
| 0.75 | 0 |
| 0.7506944444444444 | 0 |
| 0.751388888888889 | 0 |
| 0.7520833333333333 | 0 |
| 0.7527777777777778 | 0 |
| 0.7534722222222222 | 0 |
| 0.7541666666666668 | 0 |
| 0.7548611111111111 | 0 |
| 0.7555555555555555 | 0 |
| 0.75625 | 0 |
| 0.7569444444444445 | 0 |
| 0.7576388888888889 | 0 |
| 0.7583333333333333 | 0 |
| 0.7590277777777777 | 0 |
| 0.7597222222222223 | 0 |
| 0.7604166666666666 | 0 |
| 0.7611111111111111 | 0 |
| 0.7618055555555556 | 0 |
| 0.7625000000000001 | 0 |
| 0.7631944444444444 | 0 |
| 0.7638888888888888 | 0 |
| 0.7645833333333334 | 0 |
| 0.7652777777777778 | 0 |
| 0.7659722222222222 | 0 |
| 0.7666666666666666 | 0 |
| 0.7673611111111112 | 0 |
| 0.7680555555555556 | 0 |
| 0.7687499999999999 | 0 |
| 0.7694444444444444 | 0 |
| 0.7701388888888889 | 0 |
| 0.7708333333333334 | 0 |
| 0.7715277777777777 | 0 |
| 0.7722222222222223 | 0 |
| 0.7729166666666667 | 0 |
| 0.7736111111111111 | 0 |
| 0.7743055555555555 | 0 |
| 0.775 | 0 |
| 0.7756944444444445 | 0 |
| 0.7763888888888889 | 0 |
| 0.7770833333333332 | 0 |
| 0.7777777777777778 | 0 |
| 0.7784722222222222 | 0 |
| 0.7791666666666667 | 0 |
| 0.779861111111111 | 0 |
| 0.7805555555555556 | 0 |
| 0.78125 | 0 |
| 0.7819444444444444 | 0 |
| 0.782638888888889 | 0 |
| 0.7833333333333333 | 0 |
| 0.7840277777777778 | 0 |
| 0.7847222222222222 | 0 |
| 0.7854166666666668 | 0 |
| 0.7861111111111111 | 0 |
| 0.7868055555555555 | 0 |
| 0.7875 | 0 |
| 0.7881944444444445 | 0 |
| 0.7888888888888889 | 0 |
| 0.7895833333333333 | 0 |
| 0.7902777777777777 | 0 |
| 0.7909722222222223 | 0 |
| 0.7916666666666666 | 0 |
| 0.7923611111111111 | 0 |
| 0.7930555555555556 | 0 |
| 0.7937500000000001 | 0 |
| 0.7944444444444444 | 0 |
| 0.7951388888888888 | 0 |
| 0.7958333333333334 | 0 |
| 0.7965277777777778 | 0 |
| 0.7972222222222222 | 0 |
| 0.7979166666666666 | 0 |
| 0.7986111111111112 | 0 |
| 0.7993055555555556 | 0 |
| 0.7999999999999999 | 0 |
| 0.8006944444444444 | 0 |
| 0.8013888888888889 | 0 |
| 0.8020833333333334 | 0 |
| 0.8027777777777777 | 0 |
| 0.8034722222222223 | 0 |
| 0.8041666666666667 | 0 |
| 0.8048611111111111 | 0 |
| 0.8055555555555555 | 0 |
| 0.80625 | 0 |
| 0.8069444444444445 | 0 |
| 0.8076388888888889 | 0 |
| 0.8083333333333332 | 0 |
| 0.8090277777777778 | 0 |
| 0.8097222222222222 | 0 |
| 0.8104166666666667 | 0 |
| 0.811111111111111 | 0 |
| 0.8118055555555556 | 0 |
| 0.8125 | 0 |
| 0.8131944444444444 | 0 |
| 0.813888888888889 | 0 |
| 0.8145833333333333 | 0 |
| 0.8152777777777778 | 0 |
| 0.8159722222222222 | 0 |
| 0.8166666666666668 | 0 |
| 0.8173611111111111 | 0 |
| 0.8180555555555555 | 0 |
| 0.81875 | 0 |
| 0.8194444444444445 | 0 |
| 0.8201388888888889 | 0 |
| 0.8208333333333333 | 0 |
| 0.8215277777777777 | 0 |
| 0.8222222222222223 | 0 |
| 0.8229166666666666 | 0 |
| 0.8236111111111111 | 0 |
| 0.8243055555555556 | 0 |
| 0.8250000000000001 | 0 |
| 0.8256944444444444 | 0 |
| 0.8263888888888888 | 0 |
| 0.8270833333333334 | 0 |
| 0.8277777777777778 | 0 |
| 0.8284722222222222 | 0 |
| 0.8291666666666666 | 0 |
| 0.8298611111111112 | 0 |
| 0.8305555555555556 | 0 |
| 0.8312499999999999 | 0 |
| 0.8319444444444444 | 0 |
| 0.8326388888888889 | 0 |
| 0.8333333333333334 | 0 |
| 0.8340277777777777 | 0 |
| 0.8347222222222223 | 0 |
| 0.8354166666666667 | 0 |
| 0.8361111111111111 | 0 |
| 0.8368055555555555 | 0 |
| 0.8375 | 0 |
| 0.8381944444444445 | 0 |
| 0.8388888888888889 | 0 |
| 0.8395833333333332 | 0 |
| 0.8402777777777778 | 0 |
| 0.8409722222222222 | 0 |
| 0.8416666666666667 | 0 |
| 0.842361111111111 | 0 |
| 0.8430555555555556 | 0 |
| 0.84375 | 0 |
| 0.8444444444444444 | 0 |
| 0.845138888888889 | 0 |
| 0.8458333333333333 | 0 |
| 0.8465277777777778 | 0 |
| 0.8472222222222222 | 0 |
| 0.8479166666666668 | 0 |
| 0.8486111111111111 | 0 |
| 0.8493055555555555 | 0 |
| 0.85 | 0 |
| 0.8506944444444445 | 0 |
| 0.8513888888888889 | 0 |
| 0.8520833333333333 | 0 |
| 0.8527777777777777 | 0 |
| 0.8534722222222223 | 0 |
| 0.8541666666666666 | 0 |
| 0.8548611111111111 | 0 |
| 0.8555555555555556 | 0 |
| 0.8562500000000001 | 0 |
| 0.8569444444444444 | 0 |
| 0.8576388888888888 | 0 |
| 0.8583333333333334 | 0 |
| 0.8590277777777778 | 0 |
| 0.8597222222222222 | 0 |
| 0.8604166666666666 | 0 |
| 0.8611111111111112 | 0 |
| 0.8618055555555556 | 0 |
| 0.8624999999999999 | 0 |
| 0.8631944444444444 | 0 |
| 0.8638888888888889 | 0 |
| 0.8645833333333334 | 0 |
| 0.8652777777777777 | 0 |
| 0.8659722222222223 | 0 |
| 0.8666666666666667 | 0 |
| 0.8673611111111111 | 0 |
| 0.8680555555555555 | 0 |
| 0.86875 | 0 |
| 0.8694444444444445 | 0 |
| 0.8701388888888889 | 0 |
| 0.8708333333333332 | 0 |
| 0.8715277777777778 | 0 |
| 0.8722222222222222 | 0 |
| 0.8729166666666667 | 0 |
| 0.873611111111111 | 0 |
| 0.8743055555555556 | 0 |
| 0.875 | 0 |
| 0.8756944444444444 | 0 |
| 0.876388888888889 | 0 |
| 0.8770833333333333 | 0 |
| 0.8777777777777778 | 0 |
| 0.8784722222222222 | 0 |
| 0.8791666666666668 | 0 |
| 0.8798611111111111 | 0 |
| 0.8805555555555555 | 0 |
| 0.88125 | 0 |
| 0.8819444444444445 | 0 |
| 0.8826388888888889 | 0 |
| 0.8833333333333333 | 0 |
| 0.8840277777777777 | 0 |
| 0.8847222222222223 | 0 |
| 0.8854166666666666 | 0 |
| 0.8861111111111111 | 0 |
| 0.8868055555555556 | 0 |
| 0.8875000000000001 | 0 |
| 0.8881944444444444 | 0 |
| 0.8888888888888888 | 0 |
| 0.8895833333333334 | 0 |
| 0.8902777777777778 | 0 |
| 0.8909722222222222 | 0 |
| 0.8916666666666666 | 0 |
| 0.8923611111111112 | 0 |
| 0.8930555555555556 | 0 |
| 0.8937499999999999 | 0 |
| 0.8944444444444444 | 0 |
| 0.8951388888888889 | 0 |
| 0.8958333333333334 | 0 |
| 0.8965277777777777 | 0 |
| 0.8972222222222223 | 0 |
| 0.8979166666666667 | 0 |
| 0.8986111111111111 | 0 |
| 0.8993055555555555 | 0 |
| 0.9 | 0 |
| 0.9006944444444445 | 0 |
| 0.9013888888888889 | 0 |
| 0.9020833333333332 | 0 |
| 0.9027777777777778 | 0 |
| 0.9034722222222222 | 0 |
| 0.9041666666666667 | 0 |
| 0.904861111111111 | 0 |
| 0.9055555555555556 | 0 |
| 0.90625 | 0 |
| 0.9069444444444444 | 0 |
| 0.907638888888889 | 0 |
| 0.9083333333333333 | 0 |
| 0.9090277777777778 | 0 |
| 0.9097222222222222 | 0 |
| 0.9104166666666668 | 0 |
| 0.9111111111111111 | 0 |
| 0.9118055555555555 | 0 |
| 0.9125 | 0 |
| 0.9131944444444445 | 0 |
| 0.9138888888888889 | 0 |
| 0.9145833333333333 | 0 |
| 0.9152777777777777 | 0 |
| 0.9159722222222223 | 0 |
| 0.9166666666666666 | 0 |
| 0.9173611111111111 | 0 |
| 0.9180555555555556 | 0 |
| 0.9187500000000001 | 0 |
| 0.9194444444444444 | 0 |
| 0.9201388888888888 | 0 |
| 0.9208333333333334 | 0 |
| 0.9215277777777778 | 0 |
| 0.9222222222222222 | 0 |
| 0.9229166666666666 | 0 |
| 0.9236111111111112 | 0 |
| 0.9243055555555556 | 0 |
| 0.9249999999999999 | 0 |
| 0.9256944444444444 | 0 |
| 0.9263888888888889 | 0 |
| 0.9270833333333334 | 0 |
| 0.9277777777777777 | 0 |
| 0.9284722222222223 | 0 |
| 0.9291666666666667 | 0 |
| 0.9298611111111111 | 0 |
| 0.9305555555555555 | 0 |
| 0.93125 | 0 |
| 0.9319444444444445 | 0 |
| 0.9326388888888889 | 0 |
| 0.9333333333333332 | 0 |
| 0.9340277777777778 | 0 |
| 0.9347222222222222 | 0 |
| 0.9354166666666667 | 0 |
| 0.936111111111111 | 0 |
| 0.9368055555555556 | 0 |
| 0.9375 | 0 |
| 0.9381944444444444 | 0 |
| 0.938888888888889 | 0 |
| 0.9395833333333333 | 0 |
| 0.9402777777777778 | 0 |
| 0.9409722222222222 | 0 |
| 0.9416666666666668 | 0 |
| 0.9423611111111111 | 0 |
| 0.9430555555555555 | 0 |
| 0.94375 | 0 |
| 0.9444444444444445 | 0 |
| 0.9451388888888889 | 0 |
| 0.9458333333333333 | 0 |
| 0.9465277777777777 | 0 |
| 0.9472222222222223 | 0 |
| 0.9479166666666666 | 0 |
| 0.9486111111111111 | 0 |
| 0.9493055555555556 | 0 |
| 0.9500000000000001 | 0 |
| 0.9506944444444444 | 0 |
| 0.9513888888888888 | 0 |
| 0.9520833333333334 | 0 |
| 0.9527777777777778 | 0 |
| 0.9534722222222222 | 0 |
| 0.9541666666666666 | 0 |
| 0.9548611111111112 | 0 |
| 0.9555555555555556 | 0 |
| 0.9562499999999999 | 0 |
| 0.9569444444444444 | 0 |
| 0.9576388888888889 | 0 |
| 0.9583333333333334 | 0 |
| 0.9590277777777777 | 0 |
| 0.9597222222222223 | 0 |
| 0.9604166666666667 | 0 |
| 0.9611111111111111 | 0 |
| 0.9618055555555555 | 0 |
| 0.9625 | 0 |
| 0.9631944444444445 | 0 |
| 0.9638888888888889 | 0 |
| 0.9645833333333332 | 0 |
| 0.9652777777777778 | 0 |
| 0.9659722222222222 | 0 |
| 0.9666666666666667 | 0 |
| 0.967361111111111 | 0 |
| 0.9680555555555556 | 0 |
| 0.96875 | 0 |
| 0.9694444444444444 | 0 |
| 0.970138888888889 | 0 |
| 0.9708333333333333 | 0 |
| 0.9715277777777778 | 0 |
| 0.9722222222222222 | 0 |
| 0.9729166666666668 | 0 |
| 0.9736111111111111 | 0 |
| 0.9743055555555555 | 0 |
| 0.975 | 0 |
| 0.9756944444444445 | 0 |
| 0.9763888888888889 | 0 |
| 0.9770833333333333 | 0 |
| 0.9777777777777777 | 0 |
| 0.9784722222222223 | 0 |
| 0.9791666666666666 | 0 |
| 0.9798611111111111 | 0 |
| 0.9805555555555556 | 0 |
| 0.9812500000000001 | 0 |
| 0.9819444444444444 | 0 |
| 0.9826388888888888 | 0 |
| 0.9833333333333334 | 0 |
| 0.9840277777777778 | 0 |
| 0.9847222222222222 | 0 |
| 0.9854166666666666 | 0 |
| 0.9861111111111112 | 0 |
| 0.9868055555555556 | 0 |
| 0.9874999999999999 | 0 |
| 0.9881944444444444 | 0 |
| 0.9888888888888889 | 0 |
| 0.9895833333333334 | 0 |
| 0.9902777777777777 | 0 |
| 0.9909722222222223 | 0 |
| 0.9916666666666667 | 0 |
| 0.9923611111111111 | 0 |
| 0.9930555555555555 | 0 |
| 0.99375 | 0 |
| 0.9944444444444445 | 0 |
| 0.9951388888888889 | 0 |
| 0.9958333333333332 | 0 |
| 0.9965277777777778 | 0 |
| 0.9972222222222222 | 0 |
| 0.9979166666666667 | 0 |
| 0.998611111111111 | 0 |
| 0.9993055555555556 | 0 |